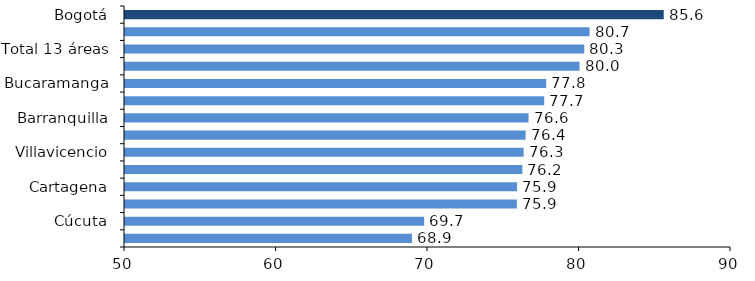
| Category | Series 0 |
|---|---|
| Bogotá | 85.56 |
| Medellín | 80.663 |
| Total 13 áreas | 80.315 |
| Pasto | 80.002 |
| Bucaramanga | 77.801 |
| Cali | 77.67 |
| Barranquilla | 76.635 |
| Pereira | 76.443 |
| Villavicencio | 76.313 |
| Montería | 76.229 |
| Cartagena | 75.88 |
| Manizales | 75.865 |
| Cúcuta | 69.746 |
| Ibagué | 68.939 |